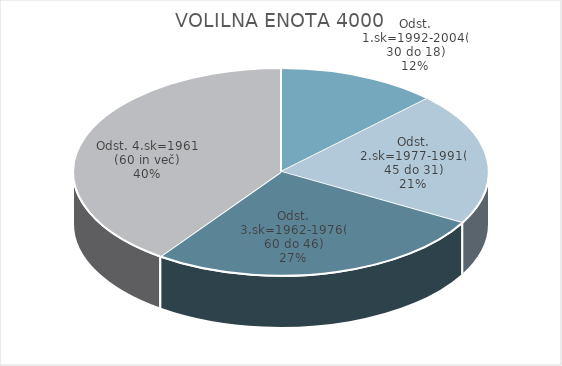
| Category | VOLILNA ENOTA 4000 |
|---|---|
| Odst. 1.sk=1992-2004(30 do 18) | 5.25 |
| Odst. 2.sk=1977-1991(45 do 31) | 8.7 |
| Odst. 3.sk=1962-1976(60 do 46) | 11.21 |
| Odst. 4.sk=1961 (60 in več) | 16.88 |